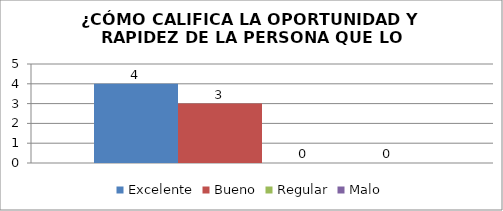
| Category | Excelente | Bueno | Regular | Malo |
|---|---|---|---|---|
| 0 | 4 | 3 | 0 | 0 |